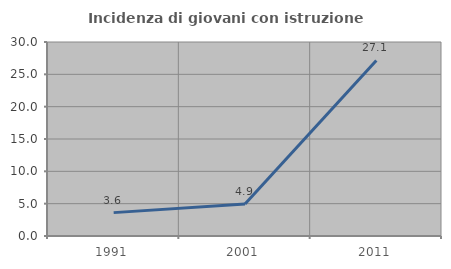
| Category | Incidenza di giovani con istruzione universitaria |
|---|---|
| 1991.0 | 3.614 |
| 2001.0 | 4.938 |
| 2011.0 | 27.143 |